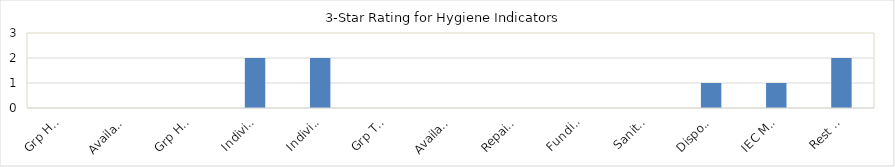
| Category | Series 0 |
|---|---|
| Grp Handwash Activity | 0 |
| Available Soap | 0 |
| Grp Handwash Facility | 0 |
| Individual Handwash Facility | 2 |
| Individual Handwash Practice | 2 |
| Grp Tooth brushing Activity | 0 |
| Available Toothbrush & paste | 0 |
| Repair & Main tenance | 0 |
| Funding of Supplies | 0 |
| Sanitary Pads | 0 |
| Disposal of Sanitary Pads | 1 |
| IEC Materials for MHM | 1 |
| Rest Space for MHM | 2 |